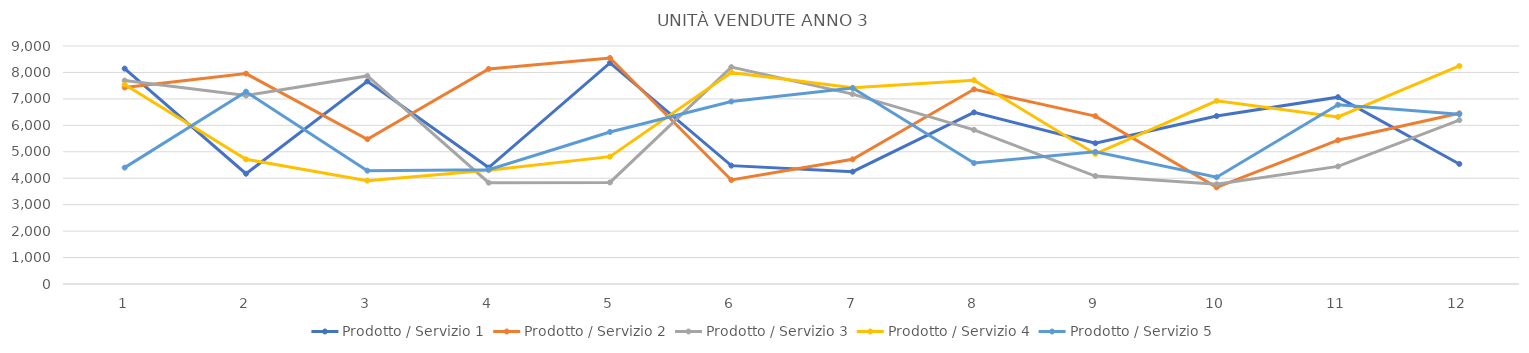
| Category | Prodotto / Servizio 1 | Prodotto / Servizio 2 | Prodotto / Servizio 3 | Prodotto / Servizio 4 | Prodotto / Servizio 5 |
|---|---|---|---|---|---|
| 0 | 8146 | 7430 | 7694 | 7544 | 4401 |
| 1 | 4171 | 7956 | 7127 | 4716 | 7273 |
| 2 | 7662 | 5475 | 7868 | 3907 | 4286 |
| 3 | 4404 | 8133 | 3831 | 4302 | 4322 |
| 4 | 8362 | 8546 | 3840 | 4816 | 5750 |
| 5 | 4476 | 3933 | 8201 | 7998 | 6900 |
| 6 | 4247 | 4715 | 7181 | 7419 | 7411 |
| 7 | 6489 | 7362 | 5828 | 7707 | 4573 |
| 8 | 5323 | 6348 | 4082 | 4919 | 4999 |
| 9 | 6351 | 3656 | 3773 | 6927 | 4036 |
| 10 | 7065 | 5437 | 4447 | 6317 | 6777 |
| 11 | 4540 | 6454 | 6195 | 8245 | 6421 |